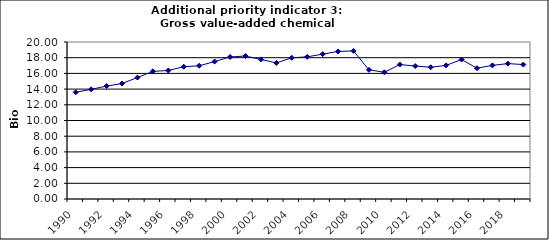
| Category | Gross value-added chemical industry, Bio Euro (EC95) |
|---|---|
| 1990 | 13.591 |
| 1991 | 13.97 |
| 1992 | 14.384 |
| 1993 | 14.712 |
| 1994 | 15.471 |
| 1995 | 16.264 |
| 1996 | 16.368 |
| 1997 | 16.851 |
| 1998 | 16.971 |
| 1999 | 17.506 |
| 2000 | 18.092 |
| 2001 | 18.213 |
| 2002 | 17.782 |
| 2003 | 17.334 |
| 2004 | 17.989 |
| 2005 | 18.11 |
| 2006 | 18.455 |
| 2007 | 18.8 |
| 2008 | 18.869 |
| 2009 | 16.454 |
| 2010 | 16.144 |
| 2011 | 17.127 |
| 2012 | 16.937 |
| 2013 | 16.782 |
| 2014 | 17.023 |
| 2015 | 17.765 |
| 2016 | 16.661 |
| 2017 | 17.023 |
| 2018 | 17.247 |
| 2019 | 17.127 |